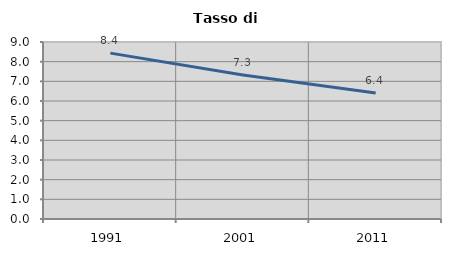
| Category | Tasso di disoccupazione   |
|---|---|
| 1991.0 | 8.434 |
| 2001.0 | 7.317 |
| 2011.0 | 6.41 |